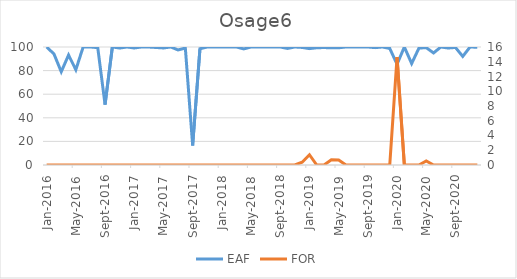
| Category | EAF |
|---|---|
| 2016-01-01 | 100 |
| 2016-02-01 | 94.13 |
| 2016-03-01 | 79.02 |
| 2016-04-01 | 93.16 |
| 2016-05-01 | 80.74 |
| 2016-06-01 | 100 |
| 2016-07-01 | 100 |
| 2016-08-01 | 99.43 |
| 2016-09-01 | 51.16 |
| 2016-10-01 | 100 |
| 2016-11-01 | 99.12 |
| 2016-12-01 | 100 |
| 2017-01-01 | 99.17 |
| 2017-02-01 | 100 |
| 2017-03-01 | 99.96 |
| 2017-04-01 | 99.58 |
| 2017-05-01 | 99.19 |
| 2017-06-01 | 100 |
| 2017-07-01 | 97.51 |
| 2017-08-01 | 99.06 |
| 2017-09-01 | 16.53 |
| 2017-10-01 | 98.52 |
| 2017-11-01 | 100 |
| 2017-12-01 | 100 |
| 2018-01-01 | 100 |
| 2018-02-01 | 100 |
| 2018-03-01 | 100 |
| 2018-04-01 | 98.37 |
| 2018-05-01 | 100 |
| 2018-06-01 | 100 |
| 2018-07-01 | 100 |
| 2018-08-01 | 100 |
| 2018-09-01 | 100 |
| 2018-10-01 | 98.79 |
| 2018-11-01 | 100 |
| 2018-12-01 | 99.62 |
| 2019-01-01 | 98.62 |
| 2019-02-01 | 99.37 |
| 2019-03-01 | 99.53 |
| 2019-04-01 | 99.31 |
| 2019-05-01 | 99.33 |
| 2019-06-01 | 100 |
| 2019-07-01 | 100 |
| 2019-08-01 | 100 |
| 2019-09-01 | 100 |
| 2019-10-01 | 99.46 |
| 2019-11-01 | 100 |
| 2019-12-01 | 98.79 |
| 2020-01-01 | 85.38 |
| 2020-02-01 | 100 |
| 2020-03-01 | 85.97 |
| 2020-04-01 | 99.08 |
| 2020-05-01 | 99.44 |
| 2020-06-01 | 94.95 |
| 2020-07-01 | 100 |
| 2020-08-01 | 99.13 |
| 2020-09-01 | 99.62 |
| 2020-10-01 | 92.02 |
| 2020-11-01 | 100 |
| 2020-12-01 | 99.78 |